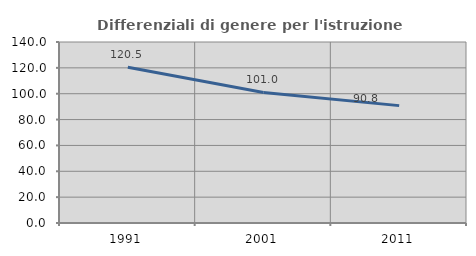
| Category | Differenziali di genere per l'istruzione superiore |
|---|---|
| 1991.0 | 120.49 |
| 2001.0 | 100.98 |
| 2011.0 | 90.791 |